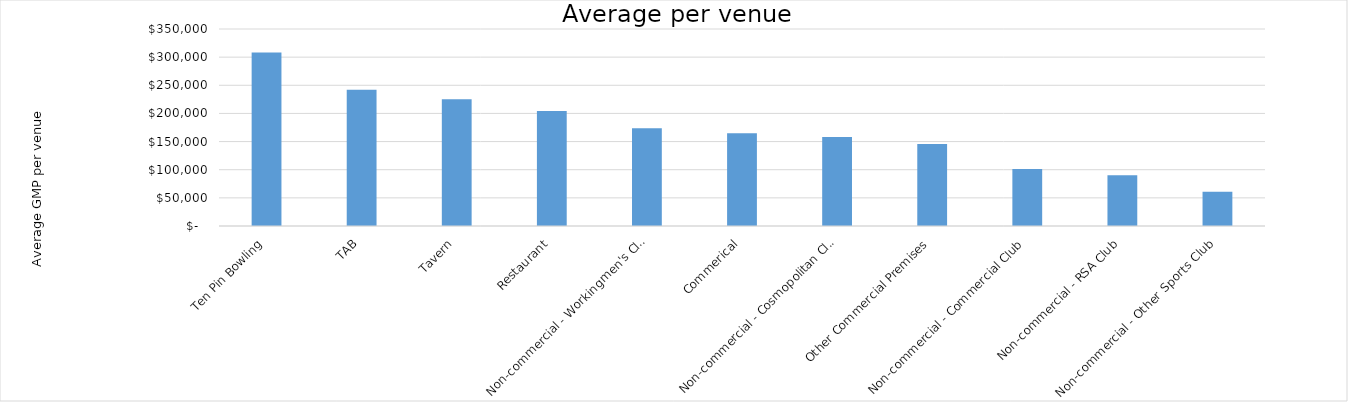
| Category | Average per venue |
|---|---|
| Ten Pin Bowling | 308318.235 |
| TAB | 241951.138 |
| Tavern | 225079.102 |
| Restaurant | 204176.022 |
| Non-commercial - Workingmen's Club | 173709.88 |
| Commerical | 164609.423 |
| Non-commercial - Cosmopolitan Club | 158321.167 |
| Other Commercial Premises | 145723.844 |
| Non-commercial - Commercial Club | 101418.485 |
| Non-commercial - RSA Club | 90142.63 |
| Non-commercial - Other Sports Club | 60940.753 |